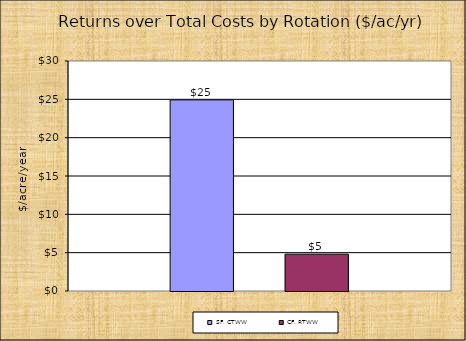
| Category | SF, CTWW | CF, RTWW |
|---|---|---|
| 0 | 24.93 | 4.804 |